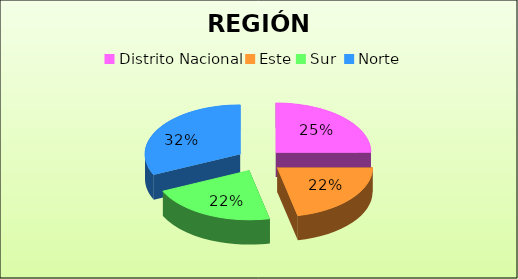
| Category | Series 0 |
|---|---|
| Distrito Nacional | 0.25 |
| Este | 0.216 |
| Sur  | 0.216 |
| Norte | 0.319 |